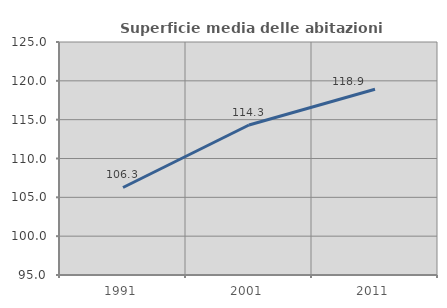
| Category | Superficie media delle abitazioni occupate |
|---|---|
| 1991.0 | 106.269 |
| 2001.0 | 114.31 |
| 2011.0 | 118.908 |